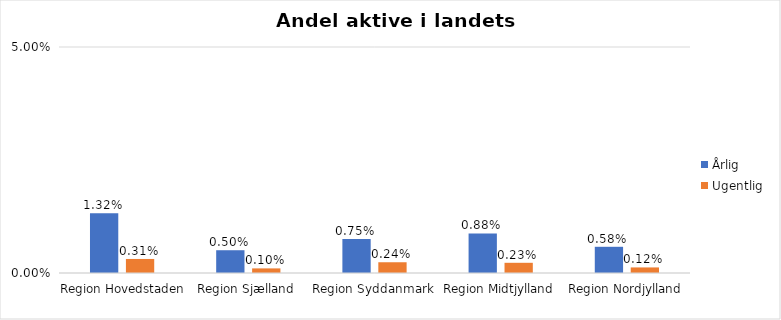
| Category | Årlig | Ugentlig |
|---|---|---|
| Region Hovedstaden | 0.013 | 0.003 |
| Region Sjælland | 0.005 | 0.001 |
| Region Syddanmark | 0.008 | 0.002 |
| Region Midtjylland | 0.009 | 0.002 |
| Region Nordjylland | 0.006 | 0.001 |